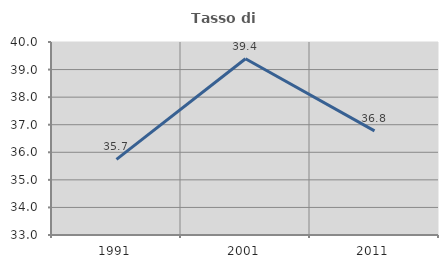
| Category | Tasso di occupazione   |
|---|---|
| 1991.0 | 35.743 |
| 2001.0 | 39.394 |
| 2011.0 | 36.776 |